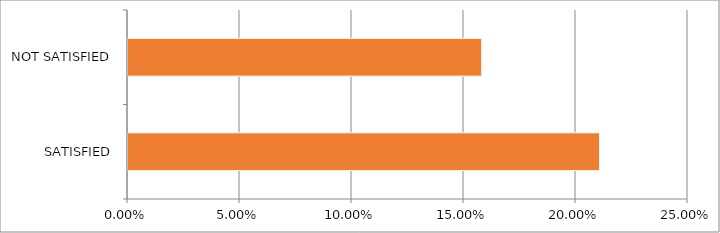
| Category | Series 0 |
|---|---|
| SATISFIED | 0.211 |
| NOT SATISFIED | 0.158 |